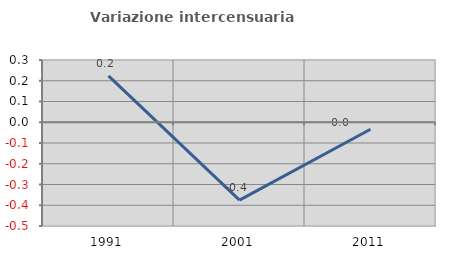
| Category | Variazione intercensuaria annua |
|---|---|
| 1991.0 | 0.224 |
| 2001.0 | -0.376 |
| 2011.0 | -0.034 |